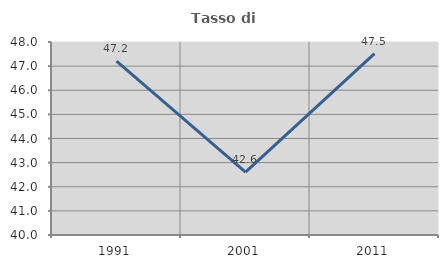
| Category | Tasso di occupazione   |
|---|---|
| 1991.0 | 47.207 |
| 2001.0 | 42.605 |
| 2011.0 | 47.515 |